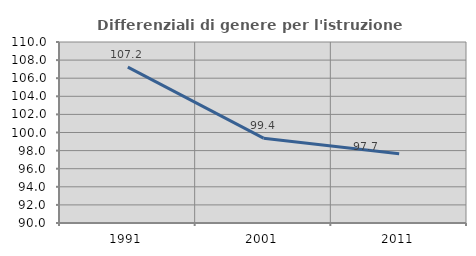
| Category | Differenziali di genere per l'istruzione superiore |
|---|---|
| 1991.0 | 107.223 |
| 2001.0 | 99.371 |
| 2011.0 | 97.653 |